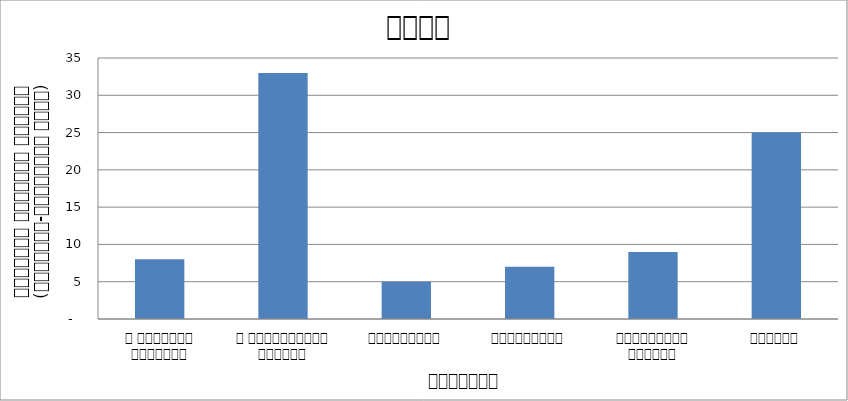
| Category | समाज |
|---|---|
| द हिमालयन टाइम्स् | 8 |
| द काठमाण्डौं पोस्ट् | 33 |
| रिपब्लिका | 5 |
| कान्तिपुर | 7 |
| अन्नपूर्ण पोस्ट् | 9 |
| नागरिक | 25 |